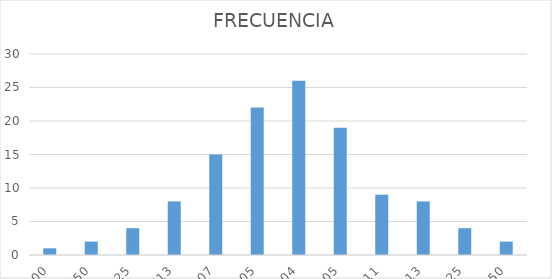
| Category | FRECUENCIA |
|---|---|
| 69.5 | 1 |
| 69.55 | 2 |
| 69.625 | 4 |
| 69.71249999999999 | 8 |
| 69.80666666666664 | 15 |
| 69.90454545454543 | 22 |
| 70.00384615384613 | 26 |
| 70.1052631578947 | 19 |
| 70.21111111111107 | 9 |
| 70.31249999999996 | 8 |
| 70.42499999999995 | 4 |
| 70.54999999999994 | 2 |